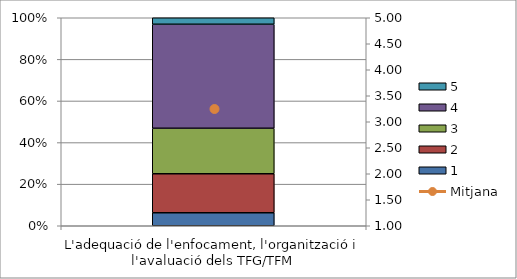
| Category | 1 | 2 | 3 | 4 | 5 |
|---|---|---|---|---|---|
| L'adequació de l'enfocament, l'organització i l'avaluació dels TFG/TFM | 2 | 6 | 7 | 16 | 1 |